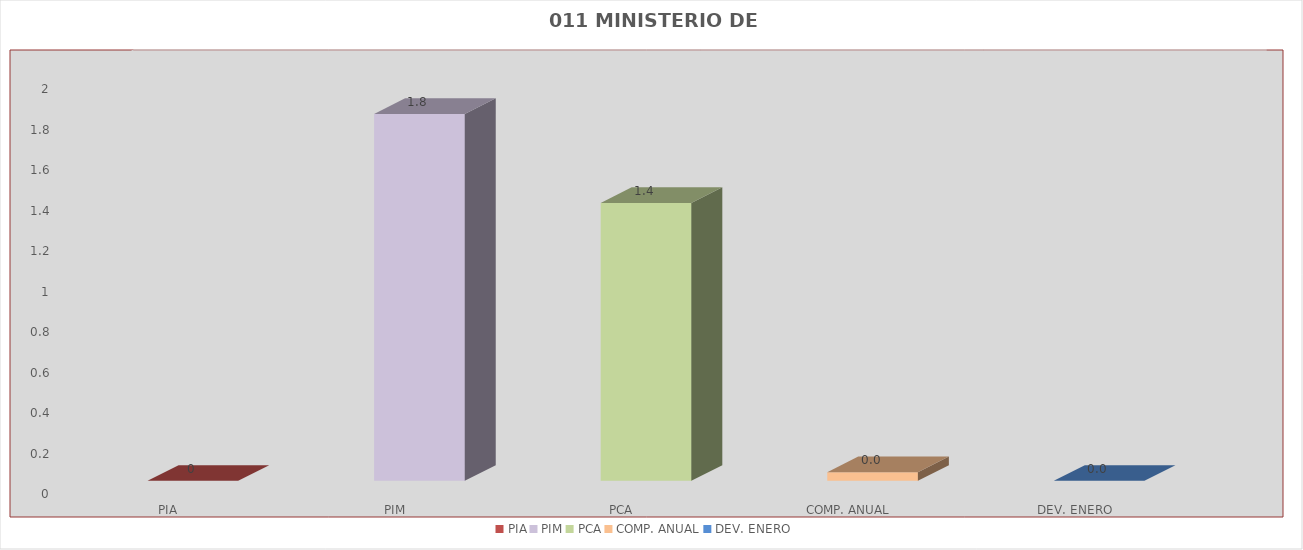
| Category | 011 MINISTERIO DE SALUD |
|---|---|
| PIA | 0 |
| PIM | 1.813 |
| PCA | 1.373 |
| COMP. ANUAL | 0.043 |
| DEV. ENERO | 0 |